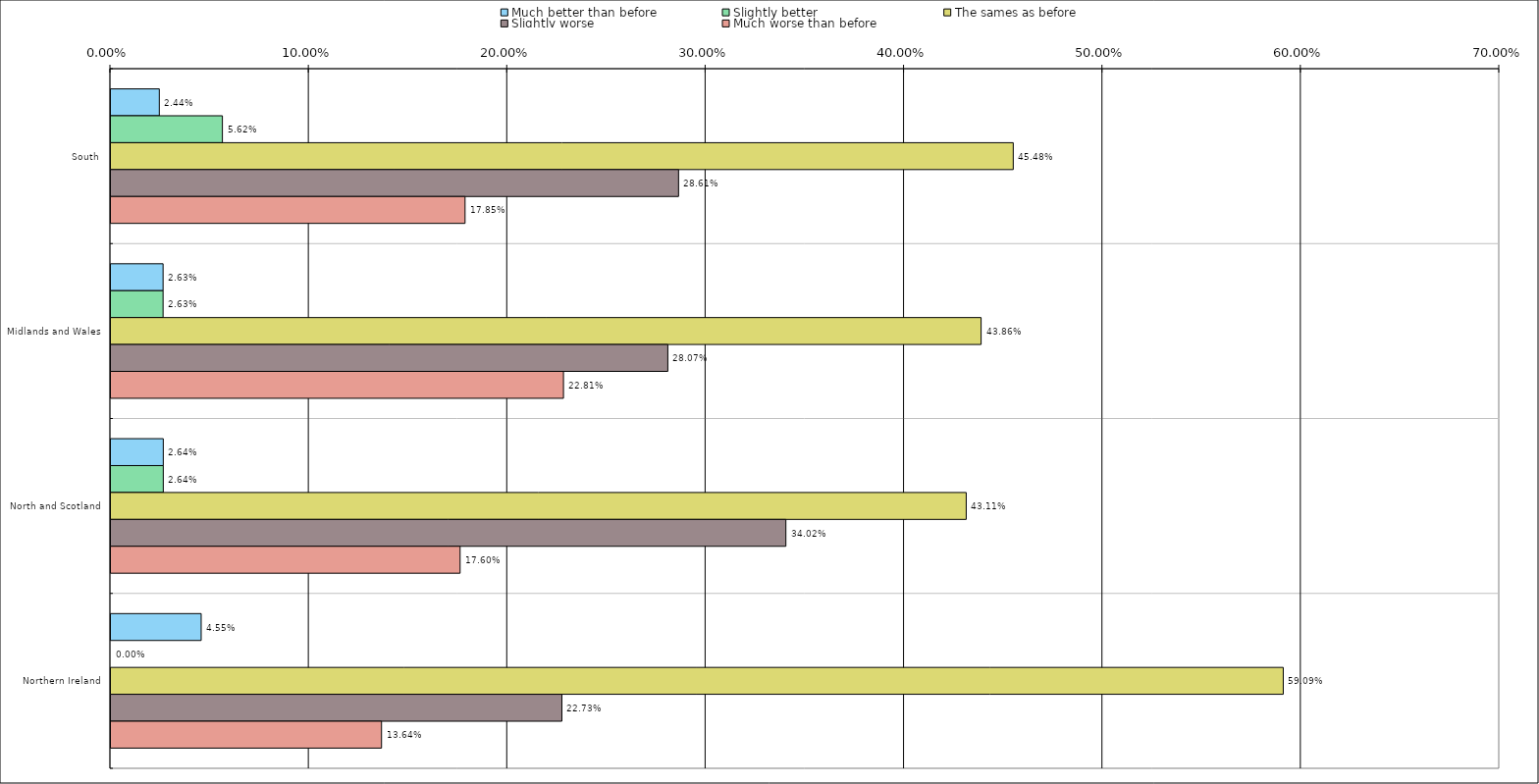
| Category | Much better than before | Slightly better | The sames as before | Slightly worse | Much worse than before |
|---|---|---|---|---|---|
| 0 | 0.024 | 0.056 | 0.455 | 0.286 | 0.178 |
| 1 | 0.026 | 0.026 | 0.439 | 0.281 | 0.228 |
| 2 | 0.026 | 0.026 | 0.431 | 0.34 | 0.176 |
| 3 | 0.046 | 0 | 0.591 | 0.227 | 0.136 |